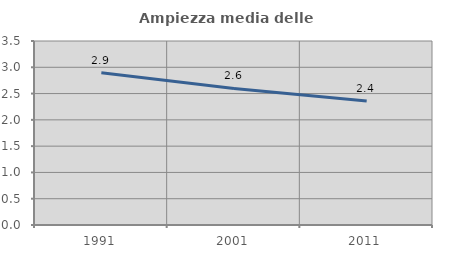
| Category | Ampiezza media delle famiglie |
|---|---|
| 1991.0 | 2.897 |
| 2001.0 | 2.597 |
| 2011.0 | 2.36 |